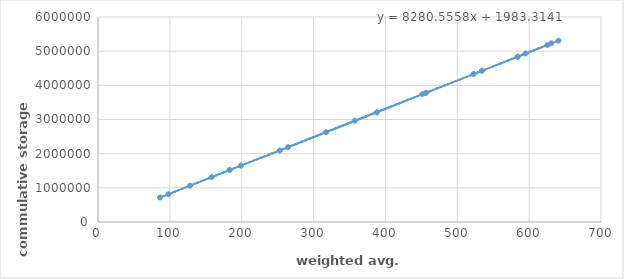
| Category | x |
|---|---|
| 86.2 | 715000 |
| 97.89999999999999 | 812200 |
| 128.1 | 1064200 |
| 183.15 | 1523200 |
| 264.34999999999997 | 2189200 |
| 357.29999999999995 | 2965000 |
| 451.5 | 3742600 |
| 534.35 | 4424800 |
| 594.95 | 4932400 |
| 630.8 | 5229400 |
| 640.8 | 5308600 |
| 625.4 | 5179000 |
| 584.0999999999999 | 4837000 |
| 522.5999999999999 | 4329400 |
| 456.5 | 3778600 |
| 388.1 | 3209800 |
| 317.45 | 2628400 |
| 253.0 | 2093800 |
| 198.95 | 1649200 |
| 158.0 | 1312600 |